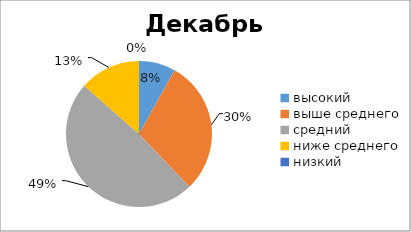
| Category | Series 0 |
|---|---|
| высокий | 3 |
| выше среднего | 11 |
| средний | 18 |
| ниже среднего | 5 |
| низкий | 0 |